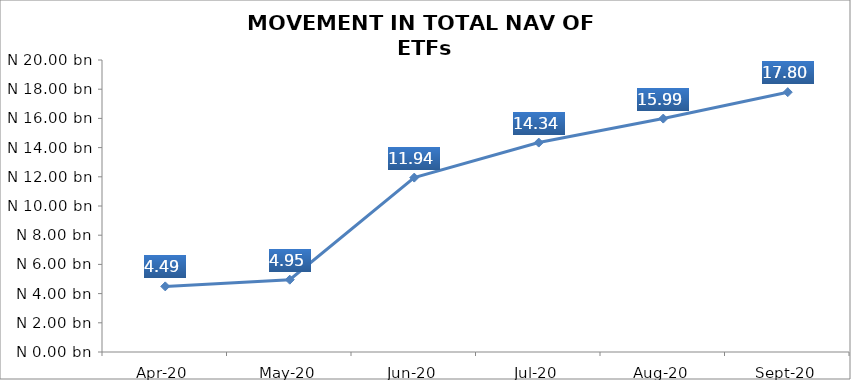
| Category | Series 0 |
|---|---|
| 2020-04-01 | 4494025633.23 |
| 2020-05-01 | 4952411842.71 |
| 2020-06-01 | 11944935776.22 |
| 2020-07-01 | 14343728259.45 |
| 2020-08-01 | 15987397591.7 |
| 2020-09-01 | 17796594275.01 |